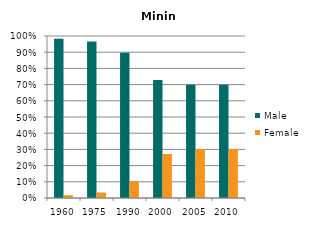
| Category | Male | Female |
|---|---|---|
| 1960.0 | 0.983 | 0.017 |
| 1975.0 | 0.966 | 0.034 |
| 1990.0 | 0.897 | 0.103 |
| 2000.0 | 0.728 | 0.272 |
| 2005.0 | 0.699 | 0.301 |
| 2010.0 | 0.699 | 0.301 |